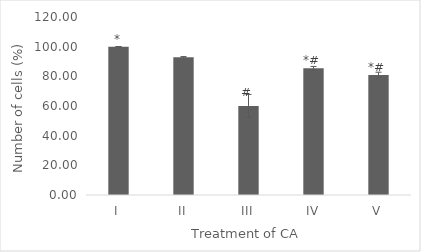
| Category | Series 0 |
|---|---|
| I | 100 |
| II | 92.823 |
| III | 60.043 |
| IV | 85.48 |
| V | 80.933 |